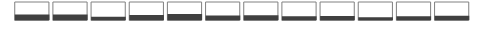
| Category | Dummy100Pct | Series 0 |
|---|---|---|
| 0 |  | 0.308 |
| 1 |  | 0.312 |
| 2 |  | 0.175 |
| 3 |  | 0.271 |
| 4 |  | 0.34 |
| 5 |  | 0.247 |
| 6 |  | 0.267 |
| 7 |  | 0.204 |
| 8 |  | 0.225 |
| 9 |  | 0.157 |
| 10 |  | 0.208 |
| 11 |  | 0.23 |